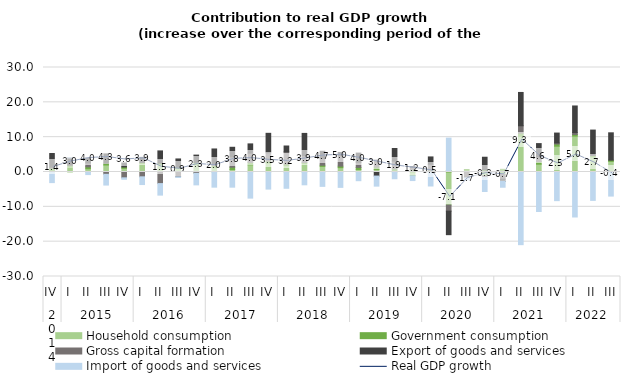
| Category | Household consumption | Government consumption | Gross capital formation | Export of goods and services | Import of goods and services |
|---|---|---|---|---|---|
| 0 | 0.488 | 0.636 | 0.237 | 3.943 | -3.045 |
| 1 | 1.369 | 0.594 | 0.023 | 2.079 | 0.012 |
| 2 | 0.934 | 0.546 | 1.115 | 1.38 | -0.743 |
| 3 | 2.006 | 0.497 | -0.669 | 2.704 | -3.081 |
| 4 | 1.069 | 0.364 | -1.672 | 1.163 | -0.421 |
| 5 | 2.418 | 0.322 | -1.384 | 1.455 | -2.215 |
| 6 | 2.213 | 0.311 | -3.328 | 3.532 | -3.31 |
| 7 | 0.946 | 0.376 | -1.386 | 2.427 | -0.192 |
| 8 | 2.215 | 0.534 | -0.372 | 2.1 | -3.323 |
| 9 | 1.254 | 0.593 | 0.29 | 4.476 | -4.351 |
| 10 | 0.702 | 0.678 | 2.958 | 2.759 | -4.357 |
| 11 | 2.07 | 0.653 | 2.687 | 2.659 | -7.496 |
| 12 | 2.59 | 0.538 | 2.384 | 5.592 | -4.909 |
| 13 | 1.824 | 0.428 | 3.536 | 1.675 | -4.673 |
| 14 | 2.402 | 0.333 | 1.917 | 6.428 | -3.675 |
| 15 | 1.61 | 0.333 | 1.946 | 2.061 | -4.127 |
| 16 | 1.249 | 0.428 | 3.022 | 0.923 | -4.415 |
| 17 | 0.732 | 0.582 | 1.476 | 2.638 | -2.495 |
| 18 | 0.754 | 0.659 | 2.018 | -1.163 | -2.891 |
| 19 | 0.27 | 0.631 | 2.217 | 3.636 | -1.938 |
| 20 | -1.105 | 0.587 | 0.739 | 0.246 | -1.352 |
| 21 | 0.019 | 0.471 | 1.713 | 2.124 | -4.017 |
| 22 | -9.509 | 0.418 | -1.728 | -6.753 | 9.303 |
| 23 | -0.003 | 0.564 | -1.529 | -0.139 | -0.571 |
| 24 | -1.066 | 0.626 | -0.458 | 3.614 | -4.081 |
| 25 | -0.727 | 0.774 | -1.328 | -0.621 | -1.7 |
| 26 | 10.222 | 0.925 | 2.128 | 9.56 | -20.861 |
| 27 | 2.246 | 0.751 | 1.336 | 3.819 | -11.349 |
| 28 | 7.411 | 0.621 | 0.297 | 2.848 | -8.225 |
| 29 | 10.307 | 0.457 | 0.537 | 7.655 | -12.916 |
| 30 | 4.339 | 0.366 | 0.13 | 7.2 | -8.154 |
| 31 | 3.053 | 0.344 | -0.005 | 7.852 | -6.909 |